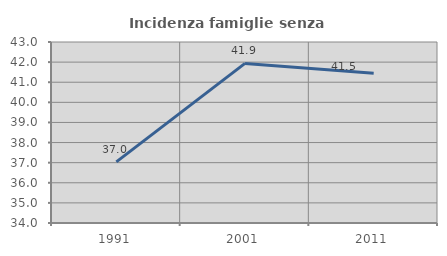
| Category | Incidenza famiglie senza nuclei |
|---|---|
| 1991.0 | 37.037 |
| 2001.0 | 41.935 |
| 2011.0 | 41.451 |